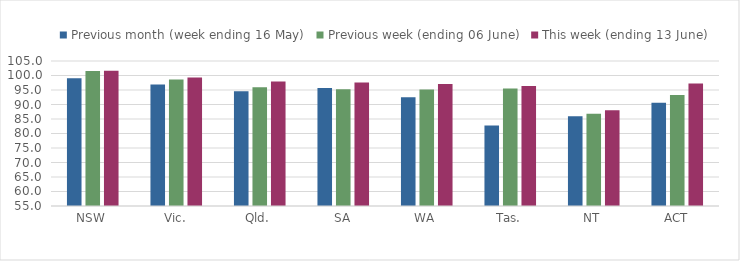
| Category | Previous month (week ending 16 May) | Previous week (ending 06 June) | This week (ending 13 June) |
|---|---|---|---|
| NSW | 99.039 | 101.573 | 101.602 |
| Vic. | 96.865 | 98.633 | 99.294 |
| Qld. | 94.606 | 95.958 | 97.96 |
| SA | 95.71 | 95.228 | 97.588 |
| WA | 92.479 | 95.2 | 97.087 |
| Tas. | 82.76 | 95.525 | 96.379 |
| NT | 85.92 | 86.835 | 87.994 |
| ACT | 90.604 | 93.289 | 97.208 |